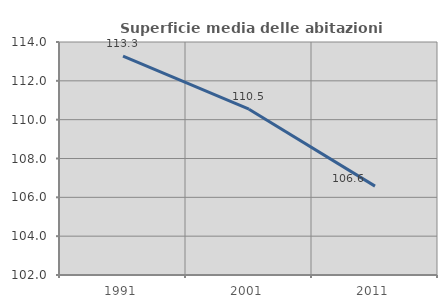
| Category | Superficie media delle abitazioni occupate |
|---|---|
| 1991.0 | 113.267 |
| 2001.0 | 110.539 |
| 2011.0 | 106.576 |